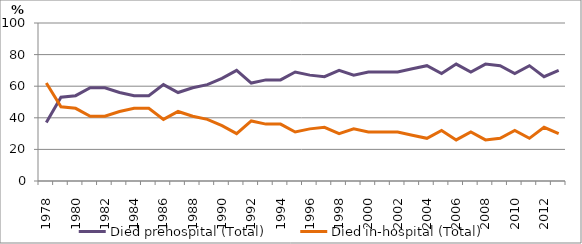
| Category | Died prehospital (Total) | Died in-hospital (Total) |
|---|---|---|
| 1978.0 | 37 | 62 |
| 1979.0 | 53 | 47 |
| 1980.0 | 54 | 46 |
| 1981.0 | 59 | 41 |
| 1982.0 | 59 | 41 |
| 1983.0 | 56 | 44 |
| 1984.0 | 54 | 46 |
| 1985.0 | 54 | 46 |
| 1986.0 | 61 | 39 |
| 1987.0 | 56 | 44 |
| 1988.0 | 59 | 41 |
| 1989.0 | 61 | 39 |
| 1990.0 | 65 | 35 |
| 1991.0 | 70 | 30 |
| 1992.0 | 62 | 38 |
| 1993.0 | 64 | 36 |
| 1994.0 | 64 | 36 |
| 1995.0 | 69 | 31 |
| 1996.0 | 67 | 33 |
| 1997.0 | 66 | 34 |
| 1998.0 | 70 | 30 |
| 1999.0 | 67 | 33 |
| 2000.0 | 69 | 31 |
| 2001.0 | 69 | 31 |
| 2002.0 | 69 | 31 |
| 2003.0 | 71 | 29 |
| 2004.0 | 73 | 27 |
| 2005.0 | 68 | 32 |
| 2006.0 | 74 | 26 |
| 2007.0 | 69 | 31 |
| 2008.0 | 74 | 26 |
| 2009.0 | 73 | 27 |
| 2010.0 | 68 | 32 |
| 2011.0 | 73 | 27 |
| 2012.0 | 66 | 34 |
| 2013.0 | 70 | 30 |